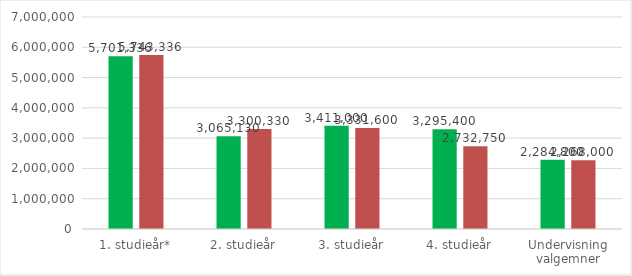
| Category | 2021 | 2020 |
|---|---|---|
| 1. studieår* | 5701335.872 | 5743335.872 |
| 2. studieår | 3065130 | 3300330 |
| 3. studieår | 3411000 | 3331600 |
| 4. studieår | 3295400 | 2732750 |
| Undervisning valgemner | 2284800 | 2268000 |